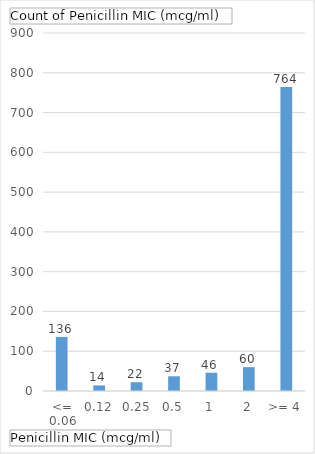
| Category | Total |
|---|---|
| <= 0.06 | 136 |
| 0.12 | 14 |
| 0.25 | 22 |
| 0.5 | 37 |
| 1 | 46 |
| 2 | 60 |
| >= 4 | 764 |